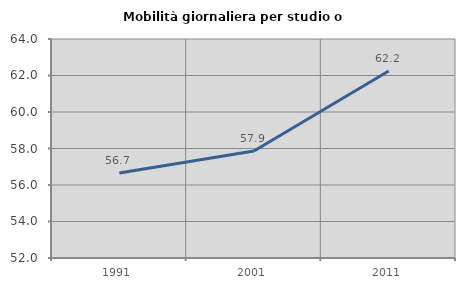
| Category | Mobilità giornaliera per studio o lavoro |
|---|---|
| 1991.0 | 56.659 |
| 2001.0 | 57.865 |
| 2011.0 | 62.243 |